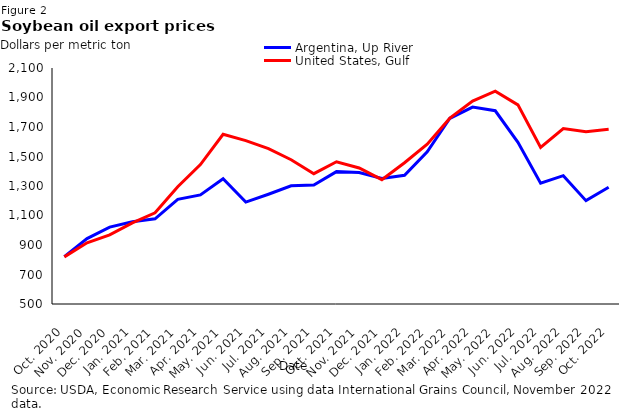
| Category | Argentina, Up River | United States, Gulf |
|---|---|---|
| Oct. 2020 | 821.14 | 819.5 |
| Nov. 2020 | 943.62 | 915.19 |
| Dec. 2020 | 1021.04 | 968.22 |
| Jan. 2021 | 1057.33 | 1049.95 |
| Feb. 2021 | 1077.85 | 1118.25 |
| Mar. 2021 | 1209.61 | 1295.09 |
| Apr. 2021 | 1239.95 | 1444.95 |
| May. 2021 | 1348.9 | 1650.71 |
| Jun. 2021 | 1190.86 | 1607.59 |
| Jul. 2021 | 1244.32 | 1553.77 |
| Aug. 2021 | 1301.36 | 1478.18 |
| Sep. 2021 | 1306.5 | 1383.55 |
| Oct. 2021 | 1397.38 | 1464.24 |
| Nov. 2021 | 1391.73 | 1421.95 |
| Dec. 2021 | 1351 | 1342.74 |
| Jan. 2022 | 1372.43 | 1457.95 |
| Feb. 2022 | 1531.9 | 1583.85 |
| Mar. 2022 | 1759.09 | 1759.96 |
| Apr. 2022 | 1834.9 | 1875.71 |
| May. 2022 | 1810.14 | 1943.23 |
| Jun. 2022 | 1596.41 | 1849.91 |
| Jul. 2022 | 1318.48 | 1561.43 |
| Aug. 2022 | 1370.26 | 1689.17 |
| Sep. 2022 | 1200.68 | 1668.41 |
| Oct. 2022 | 1291.9 | 1684.57 |